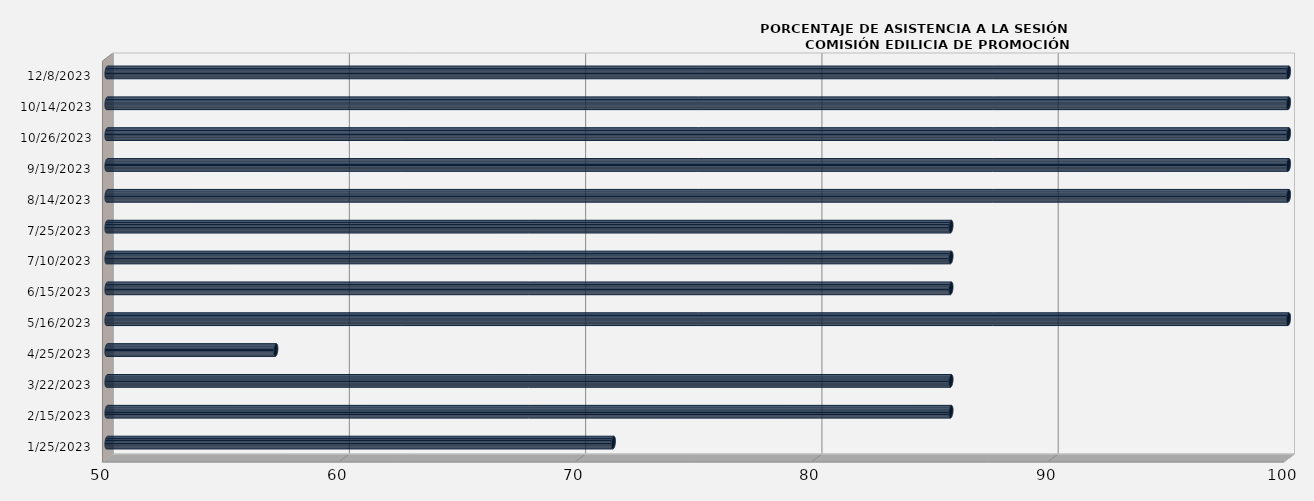
| Category | Series 0 |
|---|---|
| 1/25/23 | 71.429 |
| 2/15/23 | 85.714 |
| 3/22/23 | 85.714 |
| 4/25/23 | 57.143 |
| 5/16/23 | 100 |
| 6/15/23 | 85.714 |
| 7/10/23 | 85.714 |
| 7/25/23 | 85.714 |
| 8/14/23 | 100 |
| 9/19/23 | 100 |
| 10/26/23 | 100 |
| 10/14/23 | 100 |
| 12/8/23 | 100 |